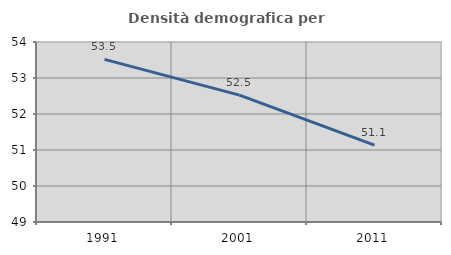
| Category | Densità demografica |
|---|---|
| 1991.0 | 53.518 |
| 2001.0 | 52.525 |
| 2011.0 | 51.135 |